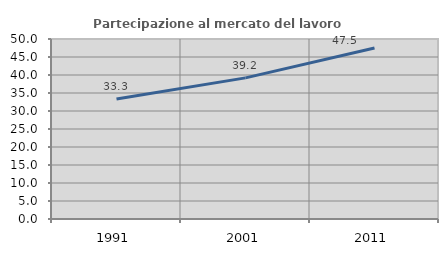
| Category | Partecipazione al mercato del lavoro  femminile |
|---|---|
| 1991.0 | 33.333 |
| 2001.0 | 39.196 |
| 2011.0 | 47.518 |